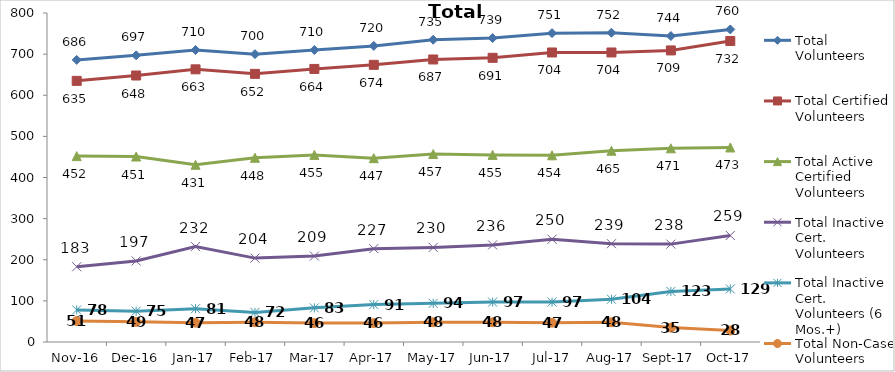
| Category | Total Volunteers | Total Certified Volunteers | Total Active Certified Volunteers | Total Inactive Cert. Volunteers | Total Inactive Cert. Volunteers (6 Mos.+) | Total Non-Case Volunteers |
|---|---|---|---|---|---|---|
| 2016-11-01 | 686 | 635 | 452 | 183 | 78 | 51 |
| 2016-12-01 | 697 | 648 | 451 | 197 | 75 | 49 |
| 2017-01-01 | 710 | 663 | 431 | 232 | 81 | 47 |
| 2017-02-01 | 700 | 652 | 448 | 204 | 72 | 48 |
| 2017-03-01 | 710 | 664 | 455 | 209 | 83 | 46 |
| 2017-04-01 | 720 | 674 | 447 | 227 | 91 | 46 |
| 2017-05-01 | 735 | 687 | 457 | 230 | 94 | 48 |
| 2017-06-01 | 739 | 691 | 455 | 236 | 97 | 48 |
| 2017-07-01 | 751 | 704 | 454 | 250 | 97 | 47 |
| 2017-08-01 | 752 | 704 | 465 | 239 | 104 | 48 |
| 2017-09-01 | 744 | 709 | 471 | 238 | 123 | 35 |
| 2017-10-01 | 760 | 732 | 473 | 259 | 129 | 28 |